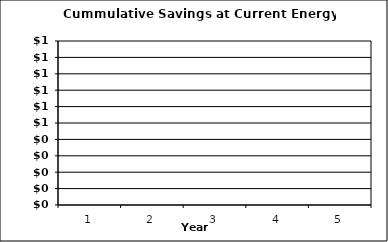
| Category | Cummulative Savings at Current Energy Prices |
|---|---|
| 0 | 0 |
| 1 | 0 |
| 2 | 0 |
| 3 | 0 |
| 4 | 0 |